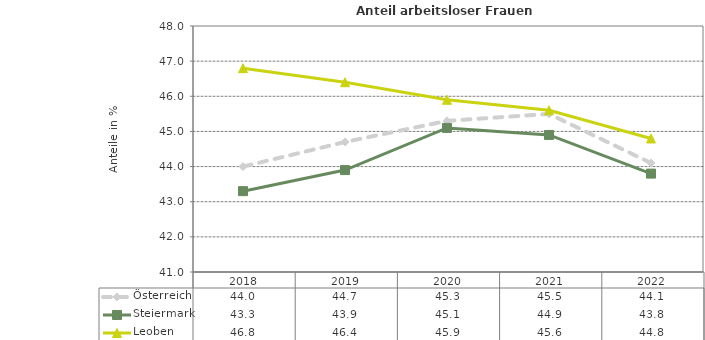
| Category | Österreich | Steiermark | Leoben |
|---|---|---|---|
| 2022.0 | 44.1 | 43.8 | 44.8 |
| 2021.0 | 45.5 | 44.9 | 45.6 |
| 2020.0 | 45.3 | 45.1 | 45.9 |
| 2019.0 | 44.7 | 43.9 | 46.4 |
| 2018.0 | 44 | 43.3 | 46.8 |